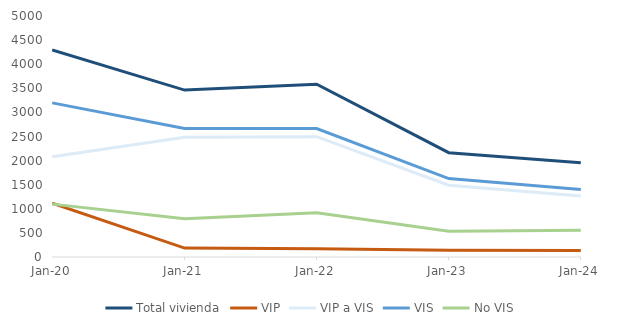
| Category | Total vivienda | VIP | VIP a VIS | VIS | No VIS |
|---|---|---|---|---|---|
| 2020-01-01 | 4295 | 1116 | 2082 | 3198 | 1097 |
| 2021-01-01 | 3463 | 185 | 2483 | 2668 | 795 |
| 2022-01-01 | 3585 | 169 | 2497 | 2666 | 919 |
| 2023-01-01 | 2164 | 138 | 1490 | 1628 | 536 |
| 2024-01-01 | 1954 | 133 | 1268 | 1401 | 553 |